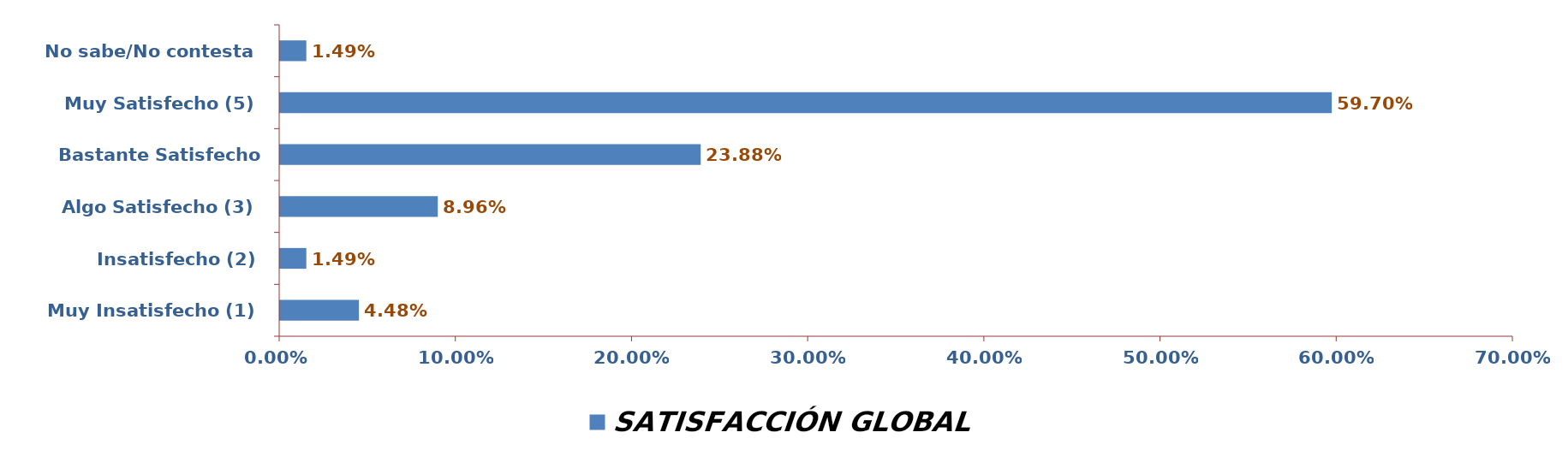
| Category | SATISFACCIÓN GLOBAL |
|---|---|
| Muy Insatisfecho (1) | 0.045 |
| Insatisfecho (2) | 0.015 |
| Algo Satisfecho (3) | 0.09 |
| Bastante Satisfecho (4) | 0.239 |
| Muy Satisfecho (5) | 0.597 |
| No sabe/No contesta | 0.015 |